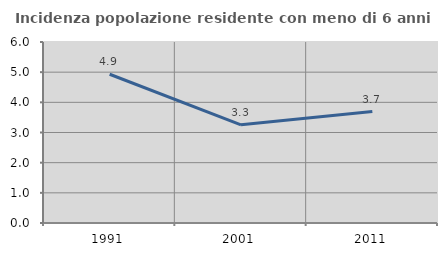
| Category | Incidenza popolazione residente con meno di 6 anni |
|---|---|
| 1991.0 | 4.931 |
| 2001.0 | 3.254 |
| 2011.0 | 3.696 |